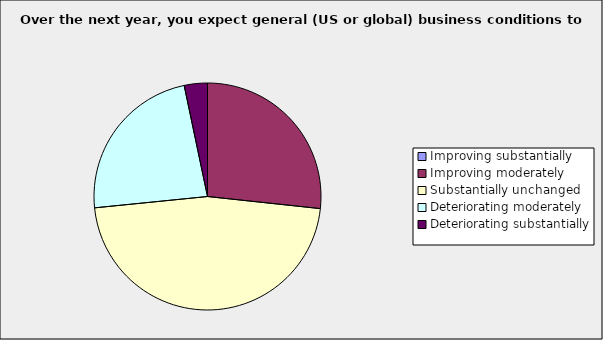
| Category | Series 0 |
|---|---|
| Improving substantially | 0 |
| Improving moderately | 0.267 |
| Substantially unchanged | 0.467 |
| Deteriorating moderately | 0.233 |
| Deteriorating substantially | 0.033 |